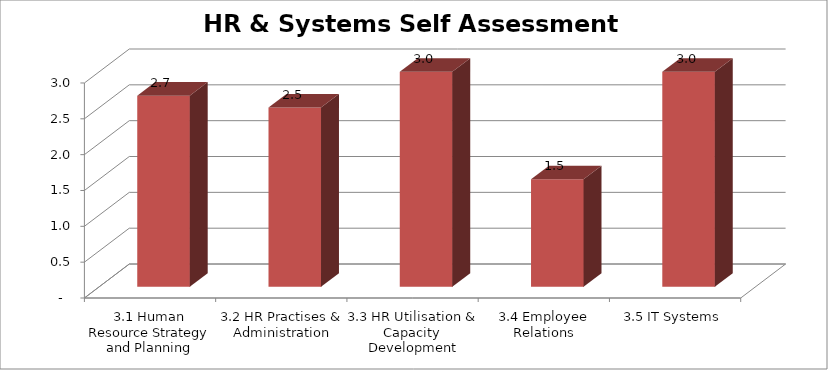
| Category | Secondary data analysis | Self assess |
|---|---|---|
| 3.1 Human Resource Strategy and Planning |  | 2.667 |
| 3.2 HR Practises & Administration |  | 2.5 |
| 3.3 HR Utilisation & Capacity Development |  | 3 |
| 3.4 Employee Relations |  | 1.5 |
| 3.5 IT Systems |  | 3 |